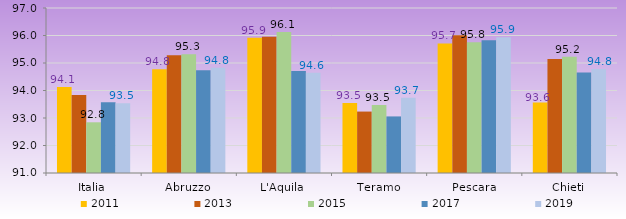
| Category | 2011 | 2013 | 2015 | 2017 | 2019 |
|---|---|---|---|---|---|
| Italia | 94.131 | 93.832 | 92.844 | 93.57 | 93.536 |
| Abruzzo | 94.769 | 95.285 | 95.321 | 94.736 | 94.83 |
| L'Aquila | 95.915 | 95.954 | 96.127 | 94.713 | 94.646 |
| Teramo | 93.545 | 93.234 | 93.47 | 93.057 | 93.736 |
| Pescara | 95.711 | 96.007 | 95.758 | 95.826 | 95.932 |
| Chieti | 93.567 | 95.15 | 95.225 | 94.655 | 94.781 |